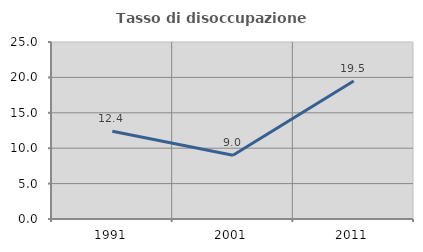
| Category | Tasso di disoccupazione giovanile  |
|---|---|
| 1991.0 | 12.392 |
| 2001.0 | 9 |
| 2011.0 | 19.485 |